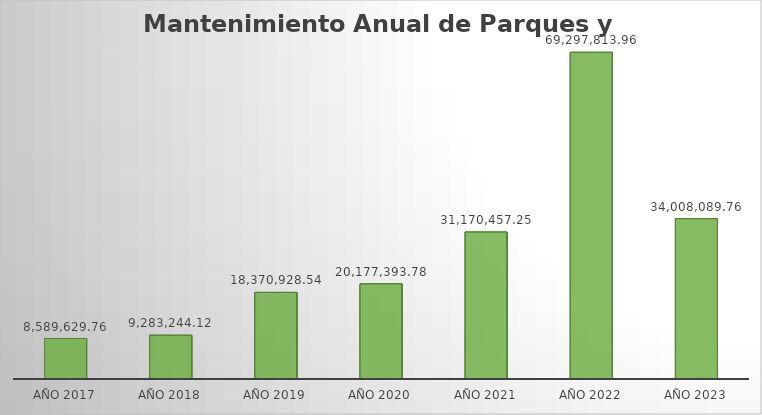
| Category | Suma |
|---|---|
| AÑO 2017 | 8589629.76 |
| AÑO 2018 | 9283244.12 |
| AÑO 2019 | 18370928.54 |
| AÑO 2020 | 20177393.78 |
| AÑO 2021 | 31170457.25 |
| AÑO 2022 | 69297813.96 |
| AÑO 2023 | 34008089.76 |